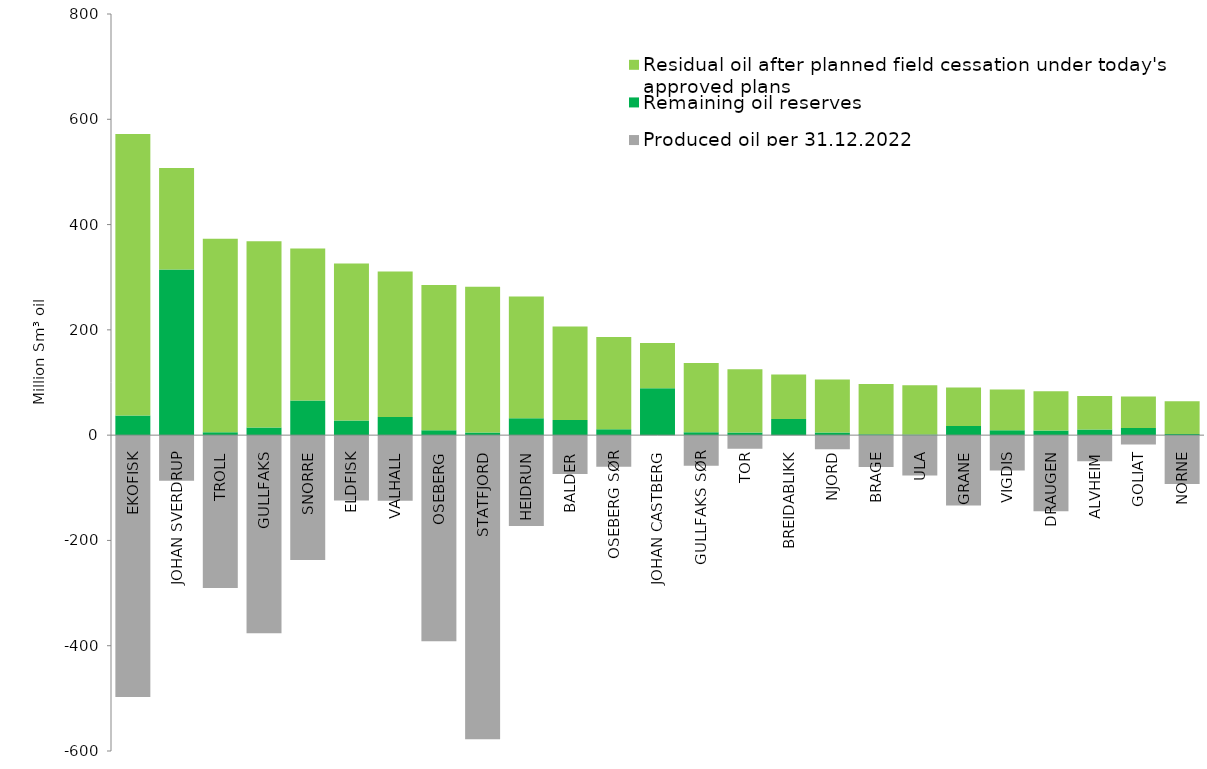
| Category | Produced oil per 31.12.2022 | Remaining oil reserves | Residual oil after planned field cessation under today's approved plans |
|---|---|---|---|
| EKOFISK | -497.19 | 37.54 | 534.37 |
| JOHAN SVERDRUP | -86.76 | 314.6 | 192.74 |
| TROLL | -290.56 | 5.54 | 367.4 |
| GULLFAKS | -376.13 | 14.35 | 354.12 |
| SNORRE | -236.95 | 65.76 | 288.59 |
| ELDFISK | -124.27 | 27.9 | 298.02 |
| VALHALL | -124.48 | 34.26 | 276.45 |
| OSEBERG | -391.36 | 9.27 | 275.77 |
| STATFJORD | -577.84 | 5 | 276.97 |
| HEIDRUN | -172.44 | 32.1 | 231.27 |
| BALDER | -73.82 | 28.99 | 177.5 |
| OSEBERG SØR | -60.07 | 11.39 | 175.14 |
| JOHAN CASTBERG | 0 | 88.97 | 86.27 |
| GULLFAKS SØR | -58.22 | 5.26 | 131.69 |
| TOR | -25.99 | 5.22 | 120.04 |
| BREIDABLIKK | 0 | 30.47 | 84.64 |
| NJORD | -26.68 | 4.98 | 100.53 |
| BRAGE | -60.34 | 1.88 | 95.14 |
| ULA | -76.65 | 1 | 93.59 |
| GRANE | -133.58 | 17.27 | 73.15 |
| VIGDIS | -67.15 | 9.12 | 77.37 |
| DRAUGEN | -144.54 | 9.04 | 74.17 |
| ALVHEIM | -49.55 | 10.92 | 63.46 |
| GOLIAT | -17.73 | 13.6 | 59.88 |
| NORNE | -92.64 | 2.02 | 62.33 |